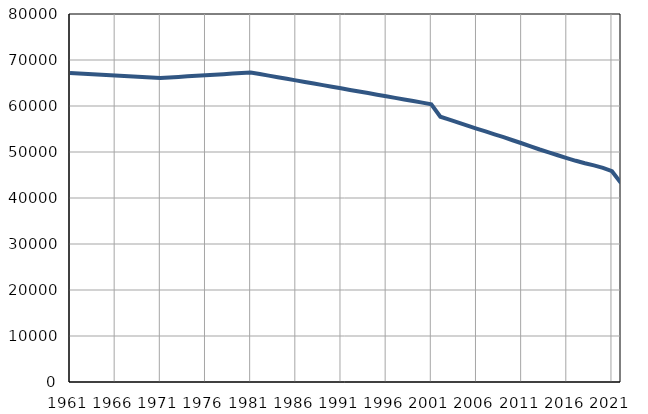
| Category | Population
size |
|---|---|
| 1961.0 | 67200 |
| 1962.0 | 67088 |
| 1963.0 | 66976 |
| 1964.0 | 66865 |
| 1965.0 | 66753 |
| 1966.0 | 66641 |
| 1967.0 | 66530 |
| 1968.0 | 66418 |
| 1969.0 | 66306 |
| 1970.0 | 66194 |
| 1971.0 | 66082 |
| 1972.0 | 66202 |
| 1973.0 | 66323 |
| 1974.0 | 66443 |
| 1975.0 | 66564 |
| 1976.0 | 66683 |
| 1977.0 | 66804 |
| 1978.0 | 66925 |
| 1979.0 | 67045 |
| 1980.0 | 67166 |
| 1981.0 | 67286 |
| 1982.0 | 66942 |
| 1983.0 | 66598 |
| 1984.0 | 66253 |
| 1985.0 | 65909 |
| 1986.0 | 65565 |
| 1987.0 | 65221 |
| 1988.0 | 64877 |
| 1989.0 | 64532 |
| 1990.0 | 64188 |
| 1991.0 | 63844 |
| 1992.0 | 63498 |
| 1993.0 | 63153 |
| 1994.0 | 62807 |
| 1995.0 | 62462 |
| 1996.0 | 62116 |
| 1997.0 | 61772 |
| 1998.0 | 61425 |
| 1999.0 | 61080 |
| 2000.0 | 60734 |
| 2001.0 | 60389 |
| 2002.0 | 57668 |
| 2003.0 | 57059 |
| 2004.0 | 56396 |
| 2005.0 | 55741 |
| 2006.0 | 55094 |
| 2007.0 | 54467 |
| 2008.0 | 53833 |
| 2009.0 | 53222 |
| 2010.0 | 52554 |
| 2011.0 | 51903 |
| 2012.0 | 51215 |
| 2013.0 | 50543 |
| 2014.0 | 49928 |
| 2015.0 | 49290 |
| 2016.0 | 48671 |
| 2017.0 | 48087 |
| 2018.0 | 47562 |
| 2019.0 | 47096 |
| 2020.0 | 46541 |
| 2021.0 | 45824 |
| 2022.0 | 43258 |